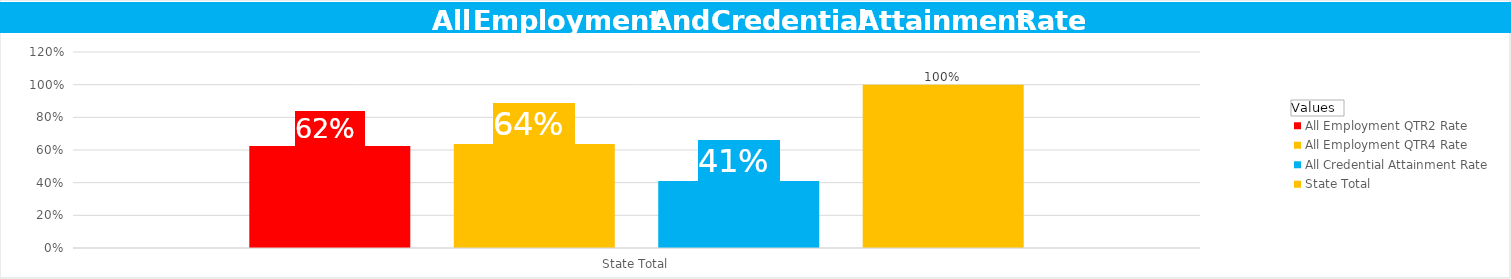
| Category | All Employment QTR2 Rate | All Employment QTR4 Rate  | All Credential Attainment Rate  | State Total |
|---|---|---|---|---|
| State Total | 0.625 | 0.637 | 0.411 | 1 |